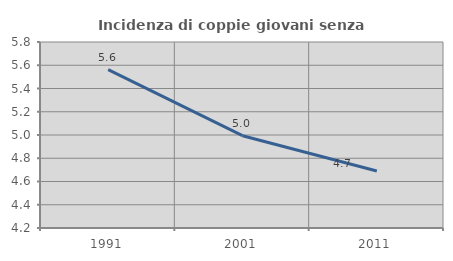
| Category | Incidenza di coppie giovani senza figli |
|---|---|
| 1991.0 | 5.563 |
| 2001.0 | 4.994 |
| 2011.0 | 4.691 |